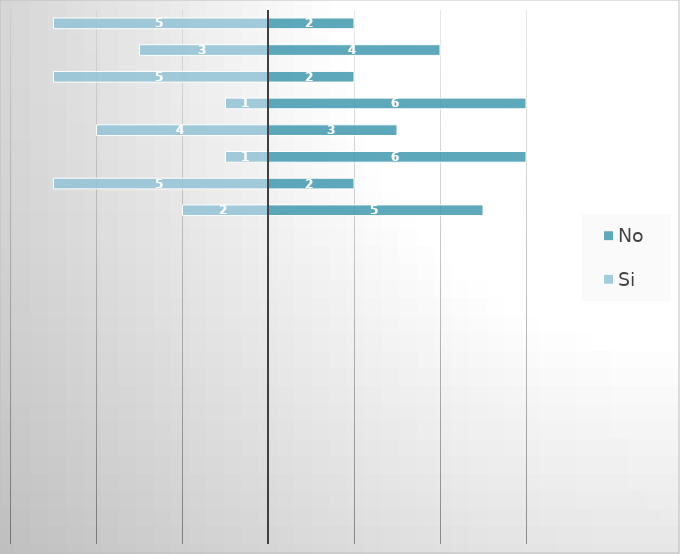
| Category | Si | No |
|---|---|---|
| ¿Le gustó su experiencia en la tienda? | 5 | -2 |
| ¿Ha comprado en nuestra tienda en línea? | 3 | -4 |
| ¿Volvería a comprar con nosotros? | 5 | -2 |
| ¿Visitaría nuestra sucursal otra vez? | 1 | -6 |
| ¿Su pedido fue entregado a tiempo? | 4 | -3 |
| ¿Le gusta la calidad de nuestros productos? | 1 | -6 |
| ¿Le gusta la empresa de logistica en la que entregamos sus paquetes? | 5 | -2 |
| ¿Le gusta el embalaje que realizamos? | 2 | -5 |
| 0 | 0 | 0 |
| 0 | 0 | 0 |
| 0 | 0 | 0 |
| 0 | 0 | 0 |
| 0 | 0 | 0 |
| 0 | 0 | 0 |
| 0 | 0 | 0 |
| 0 | 0 | 0 |
| 0 | 0 | 0 |
| 0 | 0 | 0 |
| 0 | 0 | 0 |
| 0 | 0 | 0 |